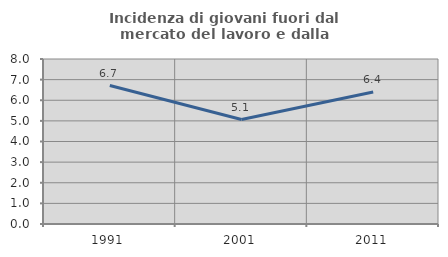
| Category | Incidenza di giovani fuori dal mercato del lavoro e dalla formazione  |
|---|---|
| 1991.0 | 6.713 |
| 2001.0 | 5.063 |
| 2011.0 | 6.4 |